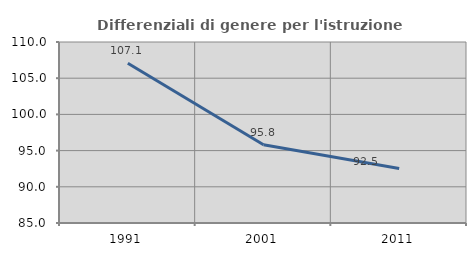
| Category | Differenziali di genere per l'istruzione superiore |
|---|---|
| 1991.0 | 107.06 |
| 2001.0 | 95.797 |
| 2011.0 | 92.529 |